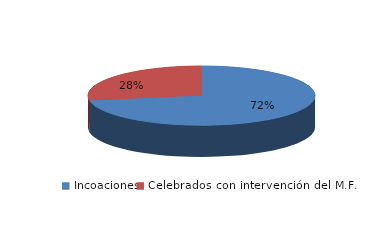
| Category | Series 0 |
|---|---|
| Incoaciones | 12774 |
| Celebrados con intervención del M.F. | 4893 |